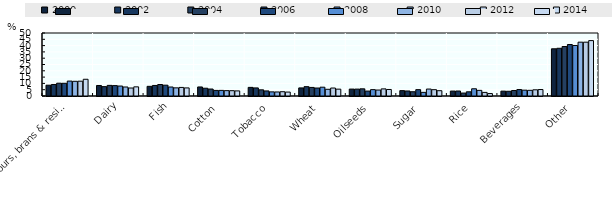
| Category | 2000 | 2002 | 2004 | 2006 | 2008 | 2010 | 2012 | 2014 |
|---|---|---|---|---|---|---|---|---|
| Flours, brans & residues | 8.57 | 9.14 | 10.166 | 10.093 | 11.839 | 11.658 | 11.745 | 13.275 |
| Dairy | 8.342 | 7.433 | 8.42 | 8.252 | 7.909 | 7.144 | 6.343 | 7.262 |
| Fish | 7.672 | 8.359 | 9.126 | 8.592 | 7.132 | 6.463 | 6.804 | 6.419 |
| Cotton | 7.174 | 6.172 | 5.536 | 4.432 | 4.456 | 4.257 | 4.223 | 4.048 |
| Tobacco | 6.837 | 6.417 | 4.904 | 4.029 | 3.285 | 3.205 | 3.401 | 3.123 |
| Wheat | 6.421 | 7.412 | 6.799 | 6.335 | 6.985 | 5.325 | 6.333 | 5.441 |
| Oilseeds | 5.493 | 5.478 | 5.697 | 3.909 | 5.056 | 4.73 | 5.65 | 5.183 |
| Sugar | 4.255 | 3.991 | 3.38 | 5.036 | 2.882 | 5.508 | 5.014 | 4.207 |
| Rice | 3.908 | 3.965 | 2.338 | 3.333 | 5.739 | 4.473 | 2.858 | 1.946 |
| Beverages | 3.864 | 3.75 | 4.367 | 5.122 | 4.633 | 4.508 | 4.917 | 5.13 |
| Other | 37.464 | 37.883 | 39.267 | 40.866 | 40.084 | 42.729 | 42.711 | 43.965 |